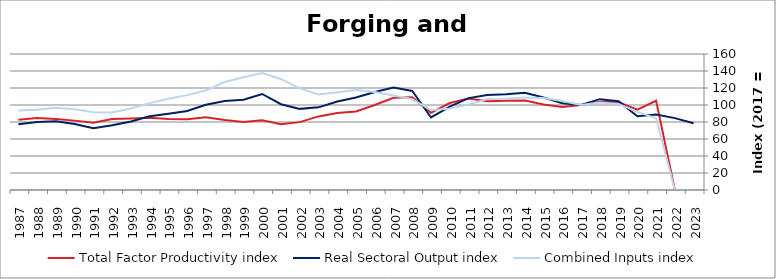
| Category | Total Factor Productivity index | Real Sectoral Output index | Combined Inputs index |
|---|---|---|---|
| 2023.0 | 0 | 78.604 | 0 |
| 2022.0 | 0 | 84.575 | 0 |
| 2021.0 | 104.957 | 88.695 | 84.506 |
| 2020.0 | 94.439 | 86.825 | 91.938 |
| 2019.0 | 103.238 | 104.517 | 101.239 |
| 2018.0 | 103.732 | 106.864 | 103.019 |
| 2017.0 | 100 | 100 | 100 |
| 2016.0 | 97.517 | 102.174 | 104.776 |
| 2015.0 | 100.532 | 108.734 | 108.158 |
| 2014.0 | 105.255 | 114.452 | 108.737 |
| 2013.0 | 104.985 | 112.557 | 107.211 |
| 2012.0 | 104.409 | 111.833 | 107.11 |
| 2011.0 | 107.626 | 108.099 | 100.439 |
| 2010.0 | 102.298 | 98.178 | 95.973 |
| 2009.0 | 90.861 | 85.31 | 93.891 |
| 2008.0 | 108.979 | 116.577 | 106.972 |
| 2007.0 | 108.4 | 120.634 | 111.286 |
| 2006.0 | 99.952 | 115.351 | 115.407 |
| 2005.0 | 92.441 | 108.786 | 117.681 |
| 2004.0 | 90.562 | 104.087 | 114.935 |
| 2003.0 | 86.598 | 97.256 | 112.307 |
| 2002.0 | 79.854 | 95.453 | 119.535 |
| 2001.0 | 77.328 | 100.943 | 130.54 |
| 2000.0 | 82.069 | 112.977 | 137.661 |
| 1999.0 | 80.077 | 106.252 | 132.687 |
| 1998.0 | 82.479 | 104.786 | 127.047 |
| 1997.0 | 85.586 | 100.189 | 117.063 |
| 1996.0 | 83.218 | 92.883 | 111.614 |
| 1995.0 | 83.497 | 89.69 | 107.417 |
| 1994.0 | 84.882 | 86.778 | 102.234 |
| 1993.0 | 84.028 | 80.587 | 95.905 |
| 1992.0 | 83.516 | 76.233 | 91.279 |
| 1991.0 | 79.247 | 72.577 | 91.583 |
| 1990.0 | 81.622 | 77.616 | 95.093 |
| 1989.0 | 83.469 | 80.789 | 96.79 |
| 1988.0 | 84.566 | 79.906 | 94.49 |
| 1987.0 | 82.66 | 77.241 | 93.444 |